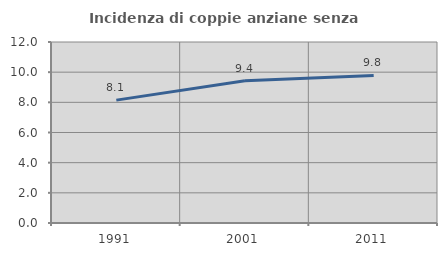
| Category | Incidenza di coppie anziane senza figli  |
|---|---|
| 1991.0 | 8.146 |
| 2001.0 | 9.429 |
| 2011.0 | 9.78 |